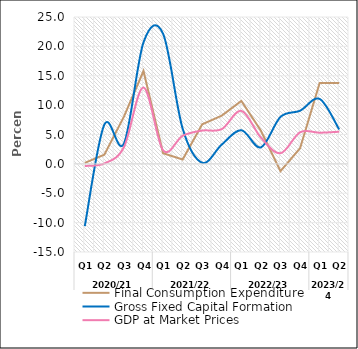
| Category | Final Consumption Expenditure | Gross Fixed Capital Formation | GDP at Market Prices |
|---|---|---|---|
| 0 | 0.171 | -10.605 | -0.36 |
| 1 | 1.57 | 6.695 | 0.076 |
| 2 | 8.045 | 3.449 | 2.837 |
| 3 | 15.808 | 20.677 | 12.995 |
| 4 | 1.797 | 22.158 | 2.313 |
| 5 | 0.74 | 6.001 | 4.783 |
| 6 | 6.745 | 0.184 | 5.67 |
| 7 | 8.218 | 3.291 | 5.913 |
| 8 | 10.709 | 5.727 | 9.027 |
| 9 | 5.646 | 2.807 | 4.472 |
| 10 | -1.225 | 7.998 | 1.813 |
| 11 | 2.661 | 9.047 | 5.378 |
| 12 | 13.76 | 11.053 | 5.305 |
| 13 | 13.754 | 5.852 | 5.472 |